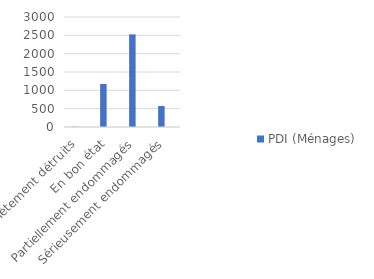
| Category | PDI (Ménages) | PDI (ménages %) |
|---|---|---|
| Complètement détruits | 10 | 0.002 |
| En bon état | 1172 | 0.274 |
| Partiellement endommagés | 2526 | 0.59 |
| Sérieusement endommagés | 574 | 0.134 |